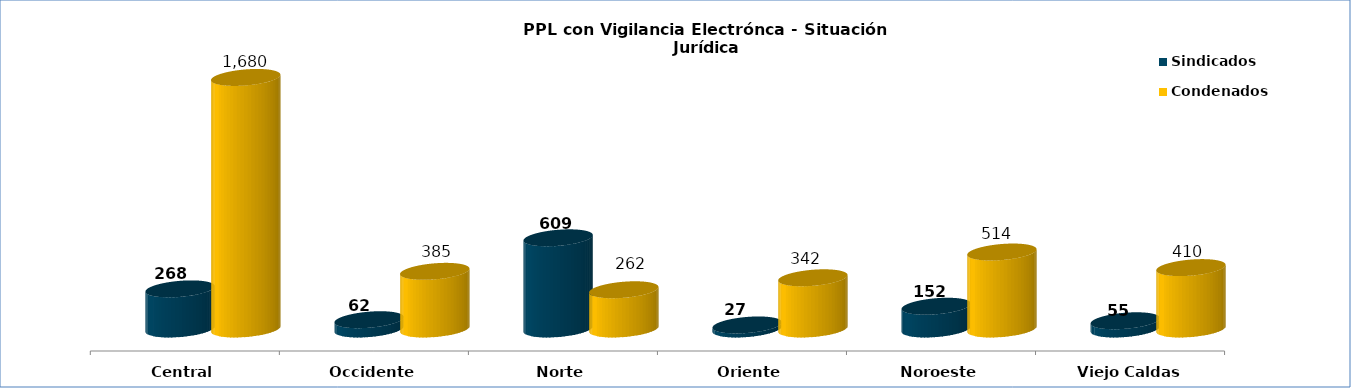
| Category | Sindicados | Condenados |
|---|---|---|
| Central | 268 | 1680 |
| Occidente | 62 | 385 |
| Norte | 609 | 262 |
| Oriente | 27 | 342 |
| Noroeste | 152 | 514 |
| Viejo Caldas | 55 | 410 |